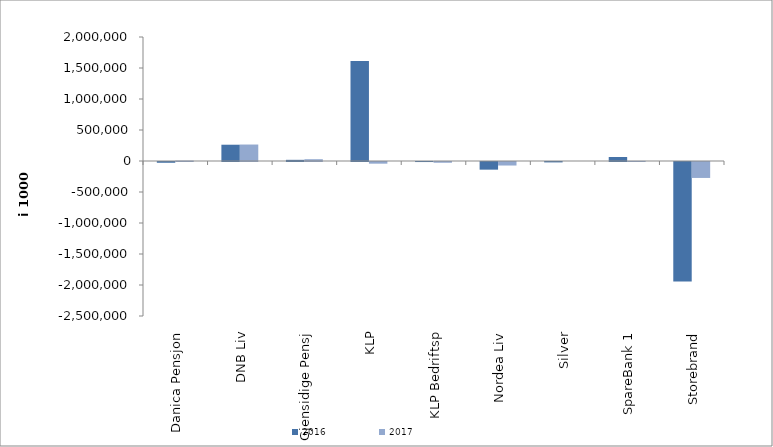
| Category | 2016 | 2017 |
|---|---|---|
| 0 | -12439.066 | 6533.34 |
| 1 | 262638 | 265666 |
| 2 | 18936.523 | 28932 |
| 3 | 1614478.551 | -27046.427 |
| 4 | -820 | -12133 |
| 5 | -123516.094 | -56828.132 |
| 6 | -6471.785 | 0 |
| 7 | 64200.531 | 1724.082 |
| 8 | -1925751.284 | -257188.065 |